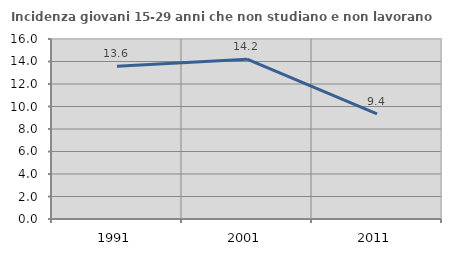
| Category | Incidenza giovani 15-29 anni che non studiano e non lavorano  |
|---|---|
| 1991.0 | 13.576 |
| 2001.0 | 14.211 |
| 2011.0 | 9.353 |